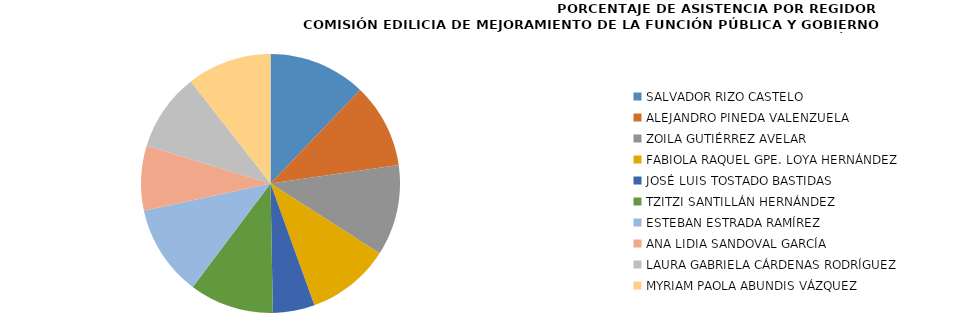
| Category | Series 0 |
|---|---|
| SALVADOR RIZO CASTELO | 100 |
| ALEJANDRO PINEDA VALENZUELA | 86.667 |
| ZOILA GUTIÉRREZ AVELAR | 93.333 |
| FABIOLA RAQUEL GPE. LOYA HERNÁNDEZ | 85.714 |
| JOSÉ LUIS TOSTADO BASTIDAS | 42.857 |
| TZITZI SANTILLÁN HERNÁNDEZ | 86.667 |
| ESTEBAN ESTRADA RAMÍREZ | 93.333 |
| ANA LIDIA SANDOVAL GARCÍA | 66.667 |
| LAURA GABRIELA CÁRDENAS RODRÍGUEZ | 80 |
| MYRIAM PAOLA ABUNDIS VÁZQUEZ | 86.667 |